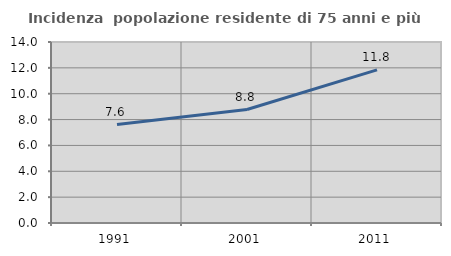
| Category | Incidenza  popolazione residente di 75 anni e più |
|---|---|
| 1991.0 | 7.61 |
| 2001.0 | 8.777 |
| 2011.0 | 11.846 |